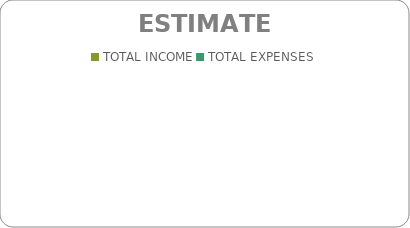
| Category | Series 0 |
|---|---|
| TOTAL INCOME | 0 |
| TOTAL EXPENSES | 0 |